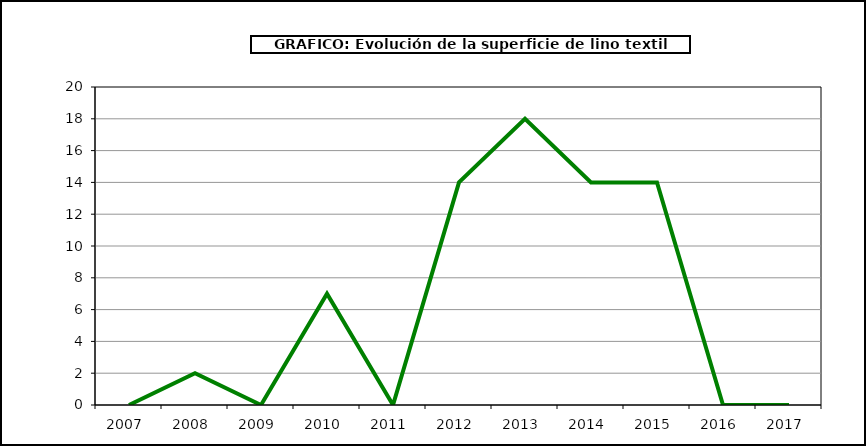
| Category | Superficie |
|---|---|
| 2007.0 | 0 |
| 2008.0 | 2 |
| 2009.0 | 0 |
| 2010.0 | 7 |
| 2011.0 | 0 |
| 2012.0 | 14 |
| 2013.0 | 18 |
| 2014.0 | 14 |
| 2015.0 | 14 |
| 2016.0 | 0 |
| 2017.0 | 0 |